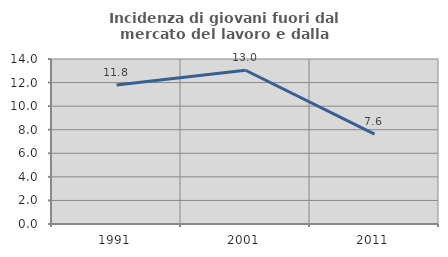
| Category | Incidenza di giovani fuori dal mercato del lavoro e dalla formazione  |
|---|---|
| 1991.0 | 11.79 |
| 2001.0 | 13.043 |
| 2011.0 | 7.623 |